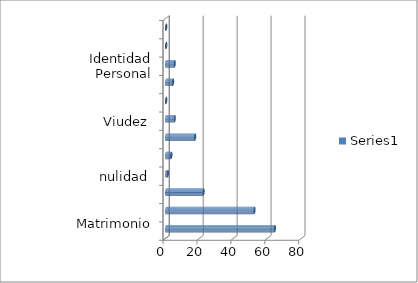
| Category | Series 0 |
|---|---|
| Matrimonio | 64 |
| Divorcio | 52 |
| Defunción | 22 |
| nulidad | 1 |
| Cancelación por Reconocimiento | 3 |
| Cancelación por Divorcio | 17 |
| Viudez | 5 |
| Rectificación Judicial/ Notarial | 0 |
| Rectificación Administración | 4 |
| Identidad Personal | 5 |
| Perdida de Autoridad Parental | 0 |
| Adecuacion | 0 |